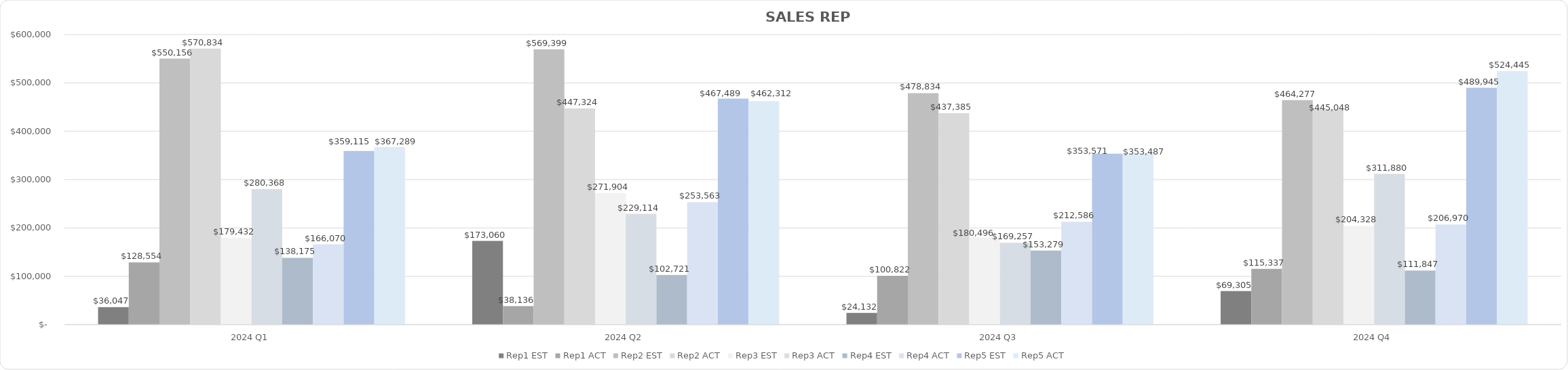
| Category | Rep1 | Rep2 | Rep3 | Rep4 | Rep5 |
|---|---|---|---|---|---|
| 2024 Q1 | 128554 | 570834 | 280368 | 166070 | 367289 |
| 2024 Q2 | 38136 | 447324 | 229114 | 253563 | 462312 |
| 2024 Q3 | 100822 | 437385 | 169257 | 212586 | 353487 |
| 2024 Q4 | 115337 | 445048 | 311880 | 206970 | 524445 |